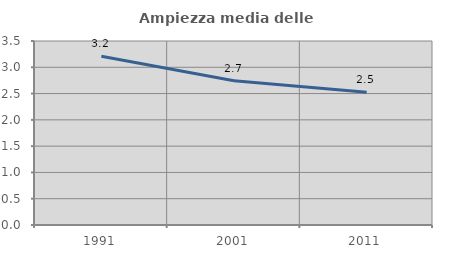
| Category | Ampiezza media delle famiglie |
|---|---|
| 1991.0 | 3.209 |
| 2001.0 | 2.743 |
| 2011.0 | 2.525 |